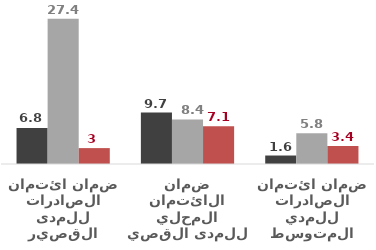
| Category | 2016 | 2017 | 2018 |
|---|---|---|---|
| ضمان ائتمان الصادرات للمدى القصير | 6.8 | 27.4 | 3 |
| ضمان الائتمان المحلي للمدى القصير | 9.7 | 8.4 | 7.1 |
| ضمان ائتمان الصادرات للمدي المتوسط | 1.6 | 5.8 | 3.4 |